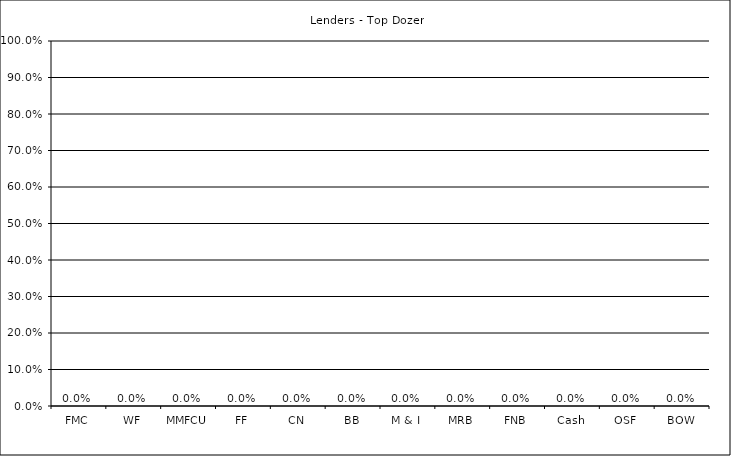
| Category | Lenders - Top Dozen |
|---|---|
| FMC | 0 |
| WF | 0 |
| MMFCU | 0 |
| FF | 0 |
| CN | 0 |
| BB | 0 |
| M & I | 0 |
| MRB | 0 |
| FNB | 0 |
| Cash | 0 |
| OSF | 0 |
| BOW | 0 |